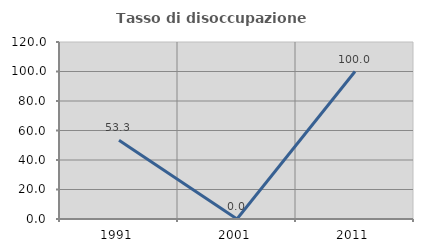
| Category | Tasso di disoccupazione giovanile  |
|---|---|
| 1991.0 | 53.333 |
| 2001.0 | 0 |
| 2011.0 | 100 |